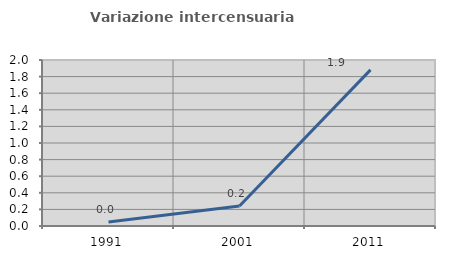
| Category | Variazione intercensuaria annua |
|---|---|
| 1991.0 | 0.047 |
| 2001.0 | 0.241 |
| 2011.0 | 1.881 |